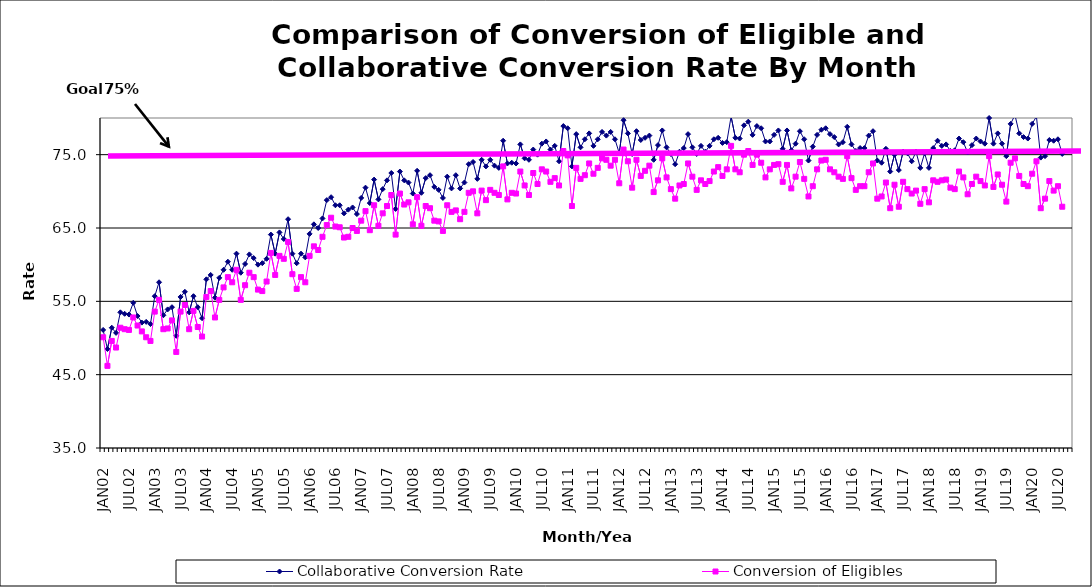
| Category | Collaborative Conversion Rate | Conversion of Eligibles |
|---|---|---|
| JAN02 | 51.1 | 50.1 |
| FEB02 | 48.5 | 46.2 |
| MAR02 | 51.4 | 49.6 |
| APR02 | 50.7 | 48.7 |
| MAY02 | 53.5 | 51.4 |
| JUN02 | 53.3 | 51.2 |
| JUL02 | 53.2 | 51.1 |
| AUG02 | 54.8 | 52.8 |
| SEP02 | 53 | 51.7 |
| OCT02 | 52.1 | 50.9 |
| NOV02 | 52.2 | 50.1 |
| DEC02 | 51.9 | 49.6 |
| JAN03 | 55.7 | 53.6 |
| FEB03 | 57.6 | 55.2 |
| MAR03 | 53.1 | 51.2 |
| APR03 | 53.9 | 51.3 |
| MAY03 | 54.2 | 52.4 |
| JUN03 | 50.3 | 48.1 |
| JUL03 | 55.6 | 53.6 |
| AUG03 | 56.3 | 54.5 |
| SEP03 | 53.5 | 51.2 |
| OCT03 | 55.7 | 53.7 |
| NOV03 | 54.2 | 51.5 |
| DEC03 | 52.7 | 50.2 |
| JAN04 | 58 | 55.6 |
| FEB04 | 58.6 | 56.4 |
| MAR04 | 55.5 | 52.8 |
| APR04 | 58.2 | 55.2 |
| MAY04 | 59.3 | 56.9 |
| JUN04 | 60.4 | 58.3 |
| JUL04 | 59.3 | 57.6 |
| AUG04 | 61.5 | 59.3 |
| SEP04 | 58.9 | 55.2 |
| OCT04 | 60.1 | 57.2 |
| NOV04 | 61.4 | 58.9 |
| DEC04 | 60.9 | 58.3 |
| JAN05 | 60 | 56.6 |
| FEB05 | 60.2 | 56.4 |
| MAR05 | 60.8 | 57.7 |
| APR05 | 64.1 | 61.6 |
| MAY05 | 61.5 | 58.6 |
| JUN05 | 64.4 | 61.2 |
| JUL05 | 63.5 | 60.8 |
| AUG05 | 66.2 | 63.1 |
| SEP05 | 61.5 | 58.7 |
| OCT05 | 60.2 | 56.7 |
| NOV05 | 61.5 | 58.3 |
| DEC05 | 61 | 57.6 |
| JAN06 | 64.2 | 61.2 |
| FEB06 | 65.5 | 62.5 |
| MAR06 | 65 | 62 |
| APR06 | 66.3 | 63.8 |
| MAY06 | 68.8 | 65.4 |
| JUN06 | 69.2 | 66.4 |
| JUL06 | 68.1 | 65.2 |
| AUG06 | 68.1 | 65.1 |
| SEP06 | 67 | 63.7 |
| OCT06 | 67.5 | 63.8 |
| NOV06 | 67.8 | 65 |
| DEC06 | 66.9 | 64.6 |
| JAN07 | 69.1 | 66 |
| FEB07 | 70.5 | 67.3 |
| MAR07 | 68.4 | 64.7 |
| APR07 | 71.6 | 68.1 |
| MAY07 | 68.9 | 65.3 |
| JUN07 | 70.3 | 67 |
| JUL07 | 71.5 | 68 |
| AUG07 | 72.5 | 69.5 |
| SEP07 | 67.6 | 64.1 |
| OCT07 | 72.7 | 69.7 |
| NOV07 | 71.5 | 68.2 |
| DEC07 | 71.2 | 68.5 |
| JAN08 | 69.7 | 65.5 |
| FEB08 | 72.8 | 69.2 |
| MAR08 | 69.8 | 65.3 |
| APR08 | 71.8 | 68 |
| MAY08 | 72.2 | 67.7 |
| JUN08 | 70.6 | 66 |
| JUL08 | 70.2 | 65.9 |
| AUG08 | 69.1 | 64.6 |
| SEP08 | 72 | 68.1 |
| OCT08 | 70.4 | 67.2 |
| NOV08 | 72.2 | 67.4 |
| DEC08 | 70.4 | 66.2 |
| JAN09 | 71.2 | 67.2 |
| FEB09 | 73.7 | 69.8 |
| MAR09 | 74 | 70 |
| APR09 | 71.7 | 67 |
| MAY09 | 74.3 | 70.1 |
| JUN09 | 73.4 | 68.8 |
| JUL09 | 74.3 | 70.2 |
| AUG09 | 73.5 | 69.8 |
| SEP09 | 73.2 | 69.5 |
| OCT09 | 76.9 | 73.4 |
| NOV09 | 73.8 | 68.9 |
| DEC09 | 73.9 | 69.8 |
| JAN10 | 73.8 | 69.7 |
| FEB10 | 76.4 | 72.7 |
| MAR10 | 74.5 | 70.8 |
| APR10 | 74.3 | 69.5 |
| MAY10 | 75.7 | 72.5 |
| JUN10 | 75 | 71 |
| JUL10 | 76.5 | 73 |
| AUG10 | 76.8 | 72.7 |
| SEP10 | 75.7 | 71.3 |
| OCT10 | 76.2 | 71.8 |
| NOV10 | 74.1 | 70.8 |
| DEC10 | 78.9 | 75.5 |
| JAN11 | 78.6 | 74.9 |
| FEB11 | 73.4 | 68 |
| MAR11 | 77.8 | 73.2 |
| APR11 | 76 | 71.7 |
| MAY11 | 77.1 | 72.2 |
| JUN11 | 77.9 | 73.8 |
| JUL11 | 76.2 | 72.4 |
| AUG11 | 77.1 | 73.2 |
| SEP11 | 78.1 | 74.5 |
| OCT11 | 77.6 | 74.3 |
| NOV11 | 78.1 | 73.5 |
| DEC11 | 77.1 | 74.3 |
| JAN12 | 75.2 | 71.1 |
| FEB12 | 79.7 | 75.7 |
| MAR12 | 77.9 | 74.1 |
| APR12 | 75.1 | 70.5 |
| MAY12 | 78.2 | 74.3 |
| JUN12 | 77 | 72.1 |
| JUL12 | 77.3 | 72.8 |
| AUG12 | 77.6 | 73.5 |
| SEP12 | 74.3 | 69.9 |
| OCT12 | 76.3 | 71.5 |
| NOV12 | 78.3 | 74.5 |
| DEC12 | 76 | 71.9 |
| JAN13 | 75.1 | 70.3 |
| FEB13 | 73.7 | 69 |
| MAR13 | 75.4 | 70.8 |
| APR13 | 75.9 | 71 |
| MAY13 | 77.8 | 73.8 |
| JUN13 | 76 | 72 |
| JUL13 | 75.1 | 70.2 |
| AUG13 | 76.2 | 71.5 |
| SEP13 | 75.4 | 71 |
| OCT13 | 76.2 | 71.4 |
| NOV13 | 77.1 | 72.7 |
| DEC13 | 77.3 | 73.3 |
| JAN14 | 76.6 | 72.1 |
| FEB14 | 76.7 | 73 |
| MAR14 | 80.2 | 76.2 |
| APR14 | 77.3 | 73 |
| MAY14 | 77.2 | 72.6 |
| JUN14 | 79 | 75 |
| JUL14 | 79.5 | 75.5 |
| AUG14 | 77.7 | 73.6 |
| SEP14 | 78.9 | 75 |
| OCT14 | 78.6 | 73.9 |
| NOV14 | 76.8 | 71.9 |
| DEC14 | 76.8 | 73 |
| JAN15 | 77.7 | 73.6 |
| FEB15 | 78.3 | 73.7 |
| MAR15 | 75.8 | 71.3 |
| APR15 | 78.3 | 73.6 |
| MAY15 | 75.6 | 70.4 |
| JUN15 | 76.5 | 72 |
| JUL15 | 78.2 | 74 |
| AUG15 | 77.1 | 71.7 |
| SEP15 | 74.2 | 69.3 |
| OCT15 | 76.1 | 70.7 |
| NOV15 | 77.7 | 73 |
| DEC15 | 78.4 | 74.2 |
| JAN16 | 78.6 | 74.3 |
| FEB16 | 77.8 | 73 |
| MAR16 | 77.4 | 72.6 |
| APR16 | 76.4 | 72 |
| MAY16 | 76.7 | 71.7 |
| JUN16 | 78.8 | 74.8 |
| JUL16 | 76.4 | 71.8 |
| AUG16 | 75.5 | 70.2 |
| SEP16 | 75.9 | 70.7 |
| OCT16 | 75.9 | 70.7 |
| NOV16 | 77.6 | 72.6 |
| DEC16 | 78.2 | 73.8 |
| JAN17 | 74.2 | 69 |
| FEB17 | 73.9 | 69.3 |
| MAR17 | 75.8 | 71.2 |
| APR17 | 72.7 | 67.7 |
| MAY17 | 75 | 70.9 |
| JUN17 | 72.9 | 67.9 |
| JUL17 | 75.4 | 71.3 |
| AUG17 | 75.2 | 70.3 |
| SEP17 | 74.1 | 69.7 |
| OCT17 | 75.4 | 70.1 |
| NOV17 | 73.2 | 68.3 |
| DEC17 | 75.2 | 70.3 |
| JAN18 | 73.2 | 68.5 |
| FEB18 | 75.9 | 71.5 |
| MAR18 | 76.9 | 71.3 |
| APR18 | 76.2 | 71.5 |
| MAY18 | 76.4 | 71.6 |
| JUN18 | 75.5 | 70.5 |
| JUL18 | 75.6 | 70.3 |
| AUG18 | 77.2 | 72.7 |
| SEP18 | 76.7 | 71.9 |
| OCT18 | 75.3 | 69.6 |
| NOV18 | 76.3 | 71 |
| DEC18 | 77.2 | 72 |
| JAN19 | 76.8 | 71.4 |
| FEB19 | 76.5 | 70.8 |
| MAR19 | 80 | 74.8 |
| APR19 | 76.5 | 70.6 |
| MAY19 | 77.9 | 72.3 |
| JUN19 | 76.5 | 70.9 |
| JUL19 | 74.8 | 68.6 |
| AUG19 | 79.2 | 73.9 |
| SEP19 | 80.4 | 74.5 |
| OCT19 | 77.9 | 72.1 |
| NOV19 | 77.4 | 71 |
| DEC19 | 77.2 | 70.7 |
| JAN20 | 79.2 | 72.4 |
| FEB20 | 80.2 | 74.1 |
| MAR20 | 74.6 | 67.7 |
| APR20 | 74.8 | 69 |
| MAY20 | 77 | 71.4 |
| JUN20 | 76.9 | 70.1 |
| JUL20 | 77.1 | 70.7 |
| AUG20 | 75.1 | 67.9 |